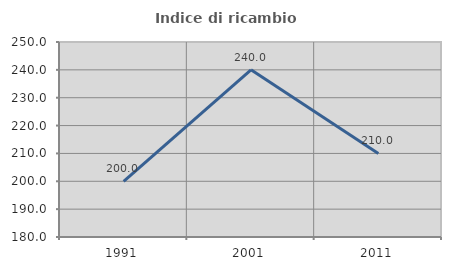
| Category | Indice di ricambio occupazionale  |
|---|---|
| 1991.0 | 200 |
| 2001.0 | 240 |
| 2011.0 | 210 |